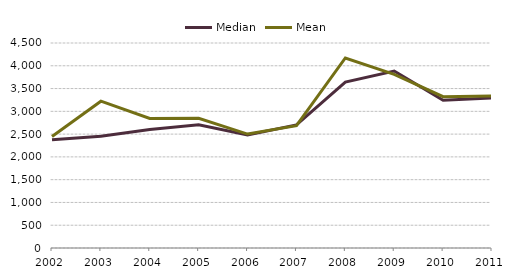
| Category | Median | Mean |
|---|---|---|
| 2002.0 | 2374.5 | 2447.667 |
| 2003.0 | 2454 | 3223.083 |
| 2004.0 | 2603 | 2842.333 |
| 2005.0 | 2707 | 2848.417 |
| 2006.0 | 2478.5 | 2500.917 |
| 2007.0 | 2702 | 2686.083 |
| 2008.0 | 3642 | 4171.333 |
| 2009.0 | 3883.5 | 3811.75 |
| 2010.0 | 3244 | 3322 |
| 2011.0 | 3291 | 3336 |